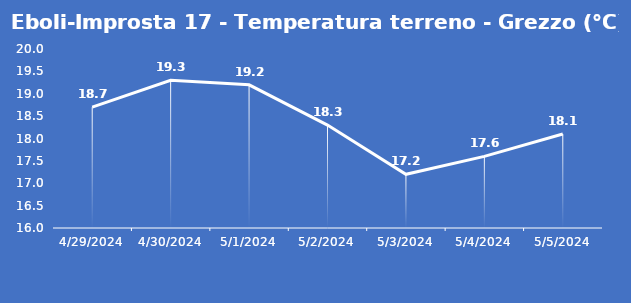
| Category | Eboli-Improsta 17 - Temperatura terreno - Grezzo (°C) |
|---|---|
| 4/29/24 | 18.7 |
| 4/30/24 | 19.3 |
| 5/1/24 | 19.2 |
| 5/2/24 | 18.3 |
| 5/3/24 | 17.2 |
| 5/4/24 | 17.6 |
| 5/5/24 | 18.1 |